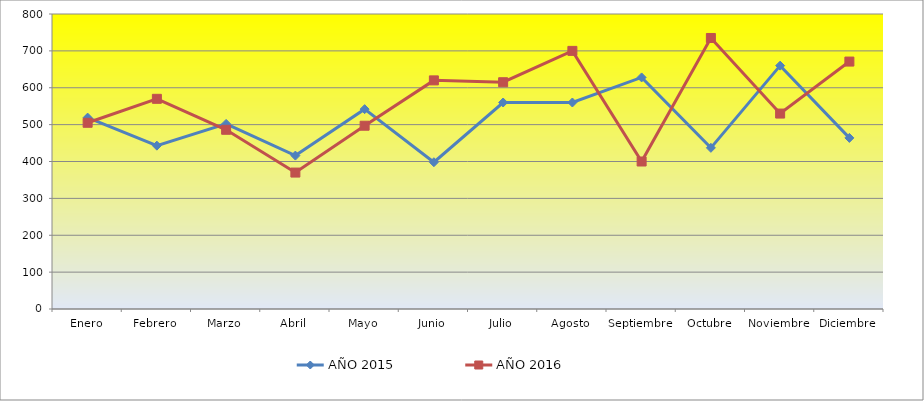
| Category | AÑO 2015 | AÑO 2016 |
|---|---|---|
| Enero | 519 | 505 |
| Febrero | 443 | 570 |
| Marzo | 502 | 486 |
| Abril | 416 | 370 |
| Mayo | 542 | 497 |
| Junio | 398 | 620 |
| Julio | 560 | 615 |
| Agosto | 560 | 700 |
| Septiembre | 628 | 400 |
| Octubre | 437 | 735 |
| Noviembre | 660 | 530 |
| Diciembre | 464 | 671 |